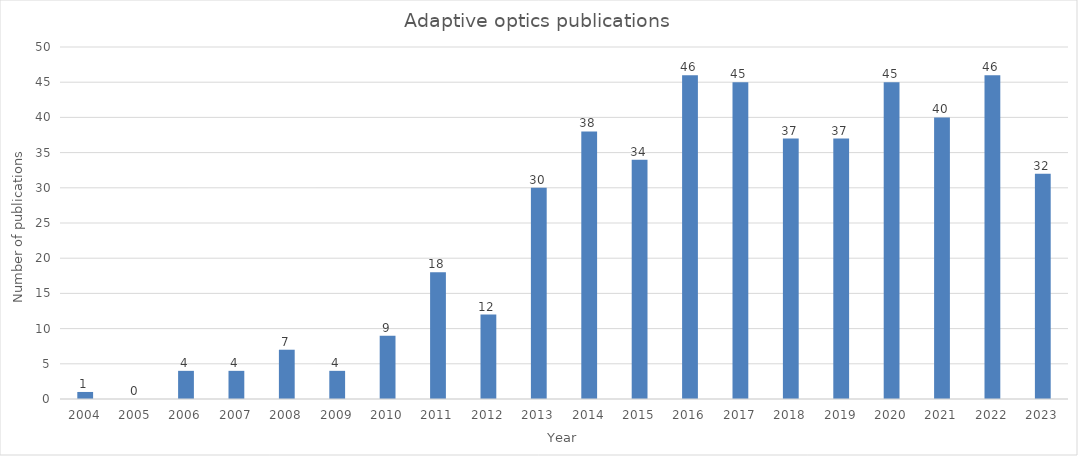
| Category | Series 0 |
|---|---|
| 2004.0 | 1 |
| 2005.0 | 0 |
| 2006.0 | 4 |
| 2007.0 | 4 |
| 2008.0 | 7 |
| 2009.0 | 4 |
| 2010.0 | 9 |
| 2011.0 | 18 |
| 2012.0 | 12 |
| 2013.0 | 30 |
| 2014.0 | 38 |
| 2015.0 | 34 |
| 2016.0 | 46 |
| 2017.0 | 45 |
| 2018.0 | 37 |
| 2019.0 | 37 |
| 2020.0 | 45 |
| 2021.0 | 40 |
| 2022.0 | 46 |
| 2023.0 | 32 |